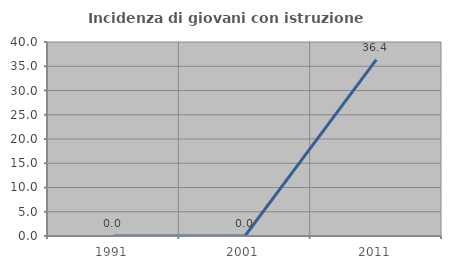
| Category | Incidenza di giovani con istruzione universitaria |
|---|---|
| 1991.0 | 0 |
| 2001.0 | 0 |
| 2011.0 | 36.364 |